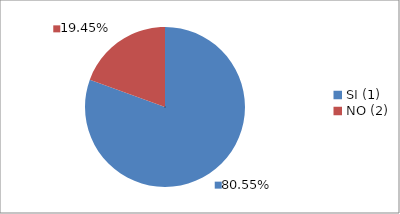
| Category | Series 0 |
|---|---|
| SI (1) | 0.806 |
| NO (2) | 0.194 |